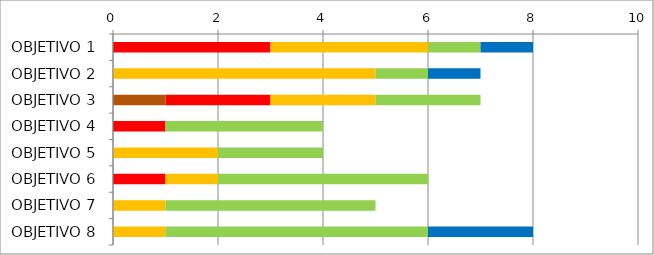
| Category | Series 0 | Series 1 | Series 2 | Series 3 | Series 4 | Series 5 |
|---|---|---|---|---|---|---|
| OBJETIVO 1 | 0 | 0 | 3 | 3 | 1 | 1 |
| OBJETIVO 2 | 0 | 0 | 0 | 5 | 1 | 1 |
| OBJETIVO 3 | 1 | 0 | 2 | 2 | 2 | 0 |
| OBJETIVO 4 | 0 | 0 | 1 | 0 | 3 | 0 |
| OBJETIVO 5 | 0 | 0 | 0 | 2 | 2 | 0 |
| OBJETIVO 6 | 0 | 0 | 1 | 1 | 4 | 0 |
| OBJETIVO 7 | 0 | 0 | 0 | 1 | 4 | 0 |
| OBJETIVO 8 | 0 | 0 | 0 | 1 | 5 | 2 |